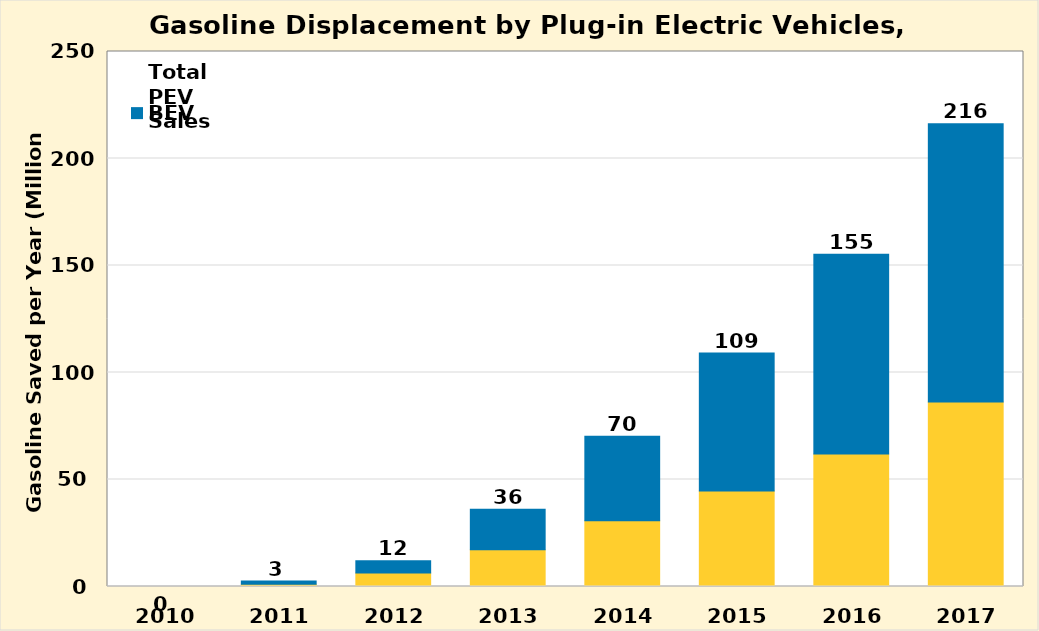
| Category | PHEV | BEV | Total PEV Sales |
|---|---|---|---|
| 2010.0 | 0.004 | 0 | 0.005 |
| 2011.0 | 1.008 | 1.505 | 2.513 |
| 2012.0 | 6.277 | 5.698 | 11.975 |
| 2013.0 | 17.117 | 18.959 | 36.076 |
| 2014.0 | 30.673 | 39.548 | 70.221 |
| 2015.0 | 44.671 | 64.396 | 109.067 |
| 2016.0 | 61.943 | 93.286 | 155.229 |
| 2017.0 | 86.255 | 130.025 | 216.28 |